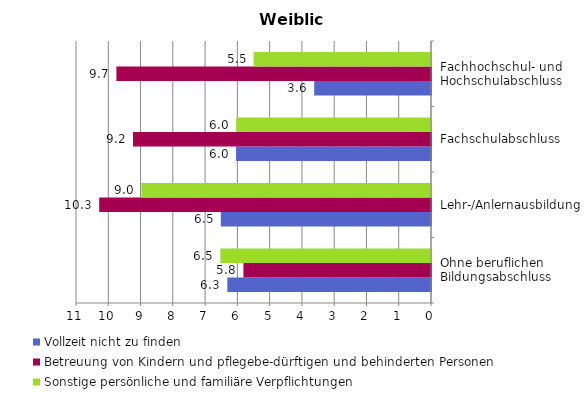
| Category | Vollzeit nicht zu finden | Betreuung von Kindern und pflegebe-dürftigen und behinderten Personen | Sonstige persönliche und familiäre Verpflichtungen |
|---|---|---|---|
| Ohne beruflichen 
Bildungsabschluss | 6.311 | 5.812 | 6.527 |
| Lehr-/Anlernausbildung | 6.512 | 10.281 | 8.973 |
| Fachschulabschluss | 6.04 | 9.233 | 6.036 |
| Fachhochschul- und 
Hochschulabschluss | 3.619 | 9.748 | 5.496 |